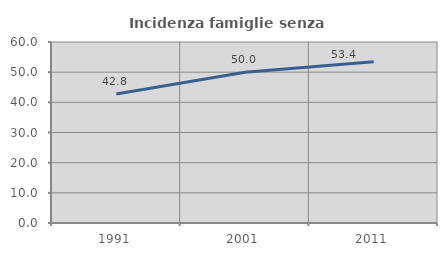
| Category | Incidenza famiglie senza nuclei |
|---|---|
| 1991.0 | 42.771 |
| 2001.0 | 50 |
| 2011.0 | 53.416 |